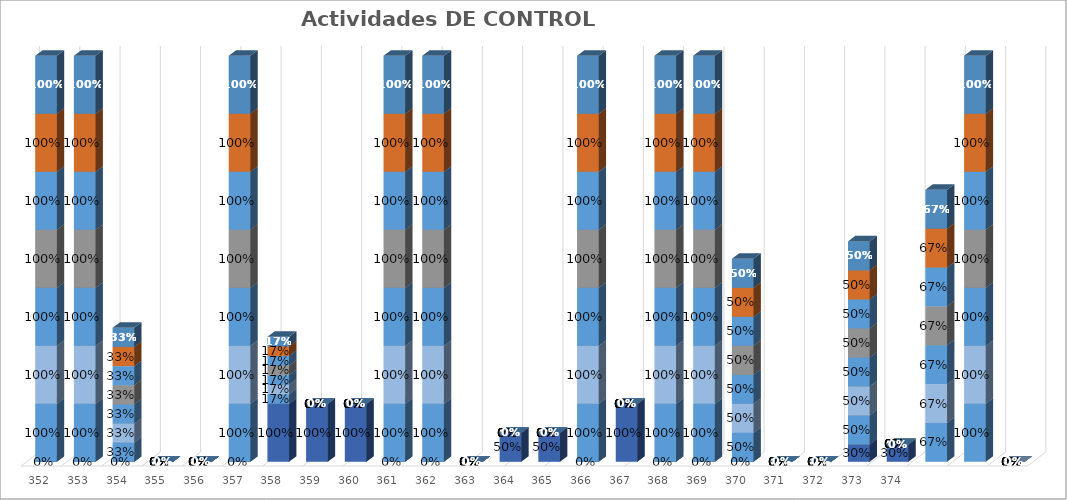
| Category | % Avance semestral |
|---|---|
| 352.0 | 1 |
| 353.0 | 1 |
| 354.0 | 0.33 |
| 355.0 | 0 |
| 356.0 | 0 |
| 357.0 | 1 |
| 358.0 | 0.165 |
| 359.0 | 0 |
| 360.0 | 0 |
| 361.0 | 1 |
| 362.0 | 1 |
| 363.0 | 0 |
| 364.0 | 0 |
| 365.0 | 0 |
| 366.0 | 1 |
| 367.0 | 0 |
| 368.0 | 1 |
| 369.0 | 1 |
| 370.0 | 0.5 |
| 371.0 | 0 |
| 372.0 | 0 |
| 373.0 | 0.5 |
| 374.0 | 0 |